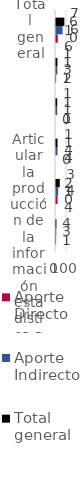
| Category | Aporte Directo | Aporte Indirecto | Total general |
|---|---|---|---|
| Articular la producción de la información estadística a nivel nacional | 1 | 3 | 4 |
| Asegurar la calidad estadística en procesos y resultados. | 14 | 20 | 34 |
| Fomentar el uso de la información estadística en la toma de decisiones públicas y privadas. | 0 | 14 | 14 |
| Mejorar el bienestar, las competencias y las habilidades de los servidores | 0 | 11 | 11 |
| Modernizar la gestión territorial del DANE. | 1 | 12 | 13 |
| Total general | 16 | 60 | 76 |